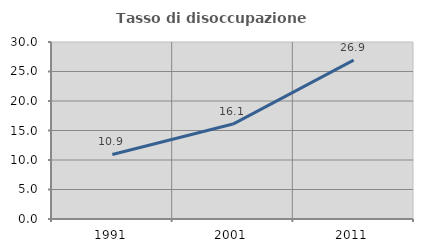
| Category | Tasso di disoccupazione giovanile  |
|---|---|
| 1991.0 | 10.938 |
| 2001.0 | 16.092 |
| 2011.0 | 26.923 |